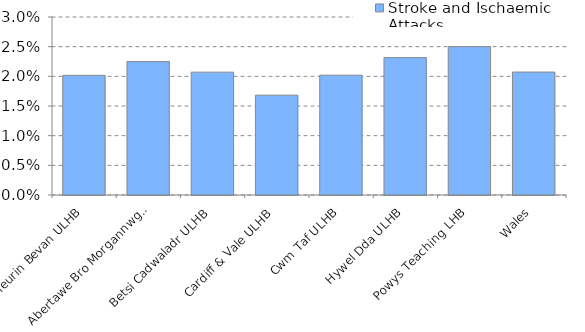
| Category | Stroke and Ischaemic Attacks |
|---|---|
| Aneurin Bevan ULHB | 0.02 |
| Abertawe Bro Morgannwg ULHB | 0.022 |
| Betsi Cadwaladr ULHB | 0.021 |
| Cardiff & Vale ULHB | 0.017 |
| Cwm Taf ULHB | 0.02 |
| Hywel Dda ULHB | 0.023 |
| Powys Teaching LHB | 0.025 |
| Wales | 0.021 |